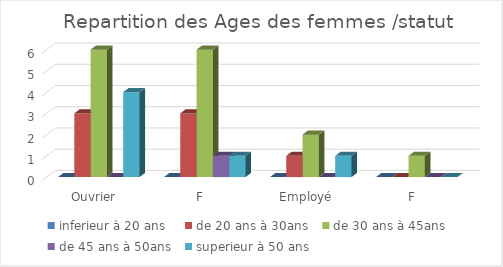
| Category | inferieur à 20 ans  | de 20 ans à 30ans | de 30 ans à 45ans | de 45 ans à 50ans | superieur à 50 ans  |
|---|---|---|---|---|---|
| 0 | 0 | 3 | 6 | 0 | 4 |
| 1 | 0 | 3 | 6 | 1 | 1 |
| 2 | 0 | 1 | 2 | 0 | 1 |
| 3 | 0 | 0 | 1 | 0 | 0 |